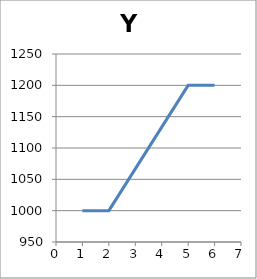
| Category | Y |
|---|---|
| 1.0 | 1000 |
| 2.0 | 1000 |
| 5.0 | 1200 |
| 6.0 | 1200 |